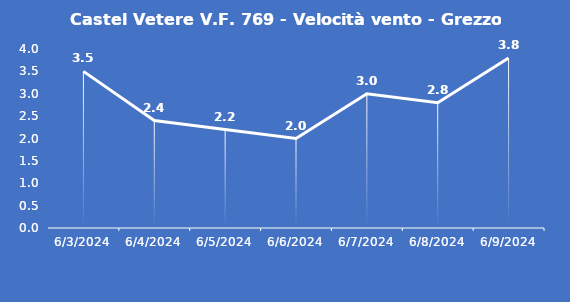
| Category | Castel Vetere V.F. 769 - Velocità vento - Grezzo (m/s) |
|---|---|
| 6/3/24 | 3.5 |
| 6/4/24 | 2.4 |
| 6/5/24 | 2.2 |
| 6/6/24 | 2 |
| 6/7/24 | 3 |
| 6/8/24 | 2.8 |
| 6/9/24 | 3.8 |